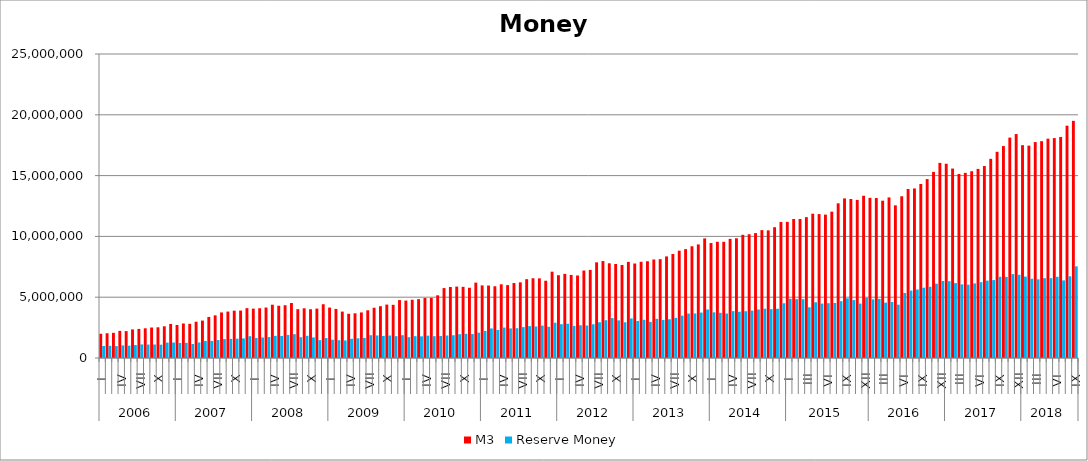
| Category | M3 | Reserve Money |
|---|---|---|
| 0 | 1993635.252 | 985529.837 |
| 1 | 2034234.826 | 1006861.291 |
| 2 | 2068041.342 | 981188.537 |
| 3 | 2231719.944 | 1037670.32 |
| 4 | 2211726.006 | 1017229.525 |
| 5 | 2350643.488 | 1063055.584 |
| 6 | 2391487.856 | 1117976.357 |
| 7 | 2443084.258 | 1106750.341 |
| 8 | 2508732.57 | 1112012.223 |
| 9 | 2525728.196 | 1095465.011 |
| 10 | 2606222.861 | 1267573.815 |
| 11 | 2799779.664 | 1272098.537 |
| 12 | 2712080.574 | 1232053.134 |
| 13 | 2839247.957 | 1248398.16 |
| 14 | 2809129.727 | 1153980.424 |
| 15 | 2983302.624 | 1277207.234 |
| 16 | 3078896.375 | 1403307.841 |
| 17 | 3374827.695 | 1404077.538 |
| 18 | 3507235.628 | 1479672.329 |
| 19 | 3747060.191 | 1555771.96 |
| 20 | 3818751.76 | 1574900.45 |
| 21 | 3892352.971 | 1588923.076 |
| 22 | 3901496.079 | 1610500.365 |
| 23 | 4098857.212 | 1793802.01 |
| 24 | 4058253.618 | 1652937.267 |
| 25 | 4091244.212 | 1686843.876 |
| 26 | 4150553.585 | 1722001.473 |
| 27 | 4381379.554 | 1820171.278 |
| 28 | 4298190.088 | 1815126.575 |
| 29 | 4341414.027 | 1897531.247 |
| 30 | 4525406.244 | 1960868.235 |
| 31 | 4014687.917 | 1706188.166 |
| 32 | 4089682.299 | 1828526.98 |
| 33 | 4009512.363 | 1691326.122 |
| 34 | 4062943.074 | 1470551.675 |
| 35 | 4421698.466 | 1642080.787 |
| 36 | 4146756.21 | 1505078.055 |
| 37 | 4035788.433 | 1464069.396 |
| 38 | 3815625.073 | 1441942.103 |
| 39 | 3637932.132 | 1578292.367 |
| 40 | 3676519.248 | 1622579.421 |
| 41 | 3746883.705 | 1654014.811 |
| 42 | 3922696.007 | 1872828.703 |
| 43 | 4133600.643 | 1856192.394 |
| 44 | 4258468.82 | 1815233.312 |
| 45 | 4392845.734 | 1850711.225 |
| 46 | 4374192.684 | 1794464.923 |
| 47 | 4763606.912 | 1874961.354 |
| 48 | 4721982.505 | 1713536.285 |
| 49 | 4792163.56 | 1796688.9 |
| 50 | 4837431.557 | 1779992.609 |
| 51 | 4938622.79 | 1840471.316 |
| 52 | 4945487.009 | 1794174.909 |
| 53 | 5154387.443 | 1814725.803 |
| 54 | 5750227.904 | 1850494.326 |
| 55 | 5840047.26 | 1871816.662 |
| 56 | 5874149.127 | 1954729.072 |
| 57 | 5852007.985 | 1997836.737 |
| 58 | 5775636.555 | 1975036.135 |
| 59 | 6199008.806 | 2081128.752 |
| 60 | 5970729.983 | 2226103.832 |
| 61 | 5959087.97 | 2430168.133 |
| 62 | 5899005.704 | 2311380.782 |
| 63 | 6062639.273 | 2505955.775 |
| 64 | 5995136.02 | 2432249.082 |
| 65 | 6164201.229 | 2448706.203 |
| 66 | 6221284.913 | 2542648.036 |
| 67 | 6481689.318 | 2621687.544 |
| 68 | 6558253.631 | 2595533.261 |
| 69 | 6550014.362 | 2664580.778 |
| 70 | 6352920.652 | 2566552.114 |
| 71 | 7097777.273 | 2901038.828 |
| 72 | 6808396.175 | 2780440.849 |
| 73 | 6918705.592 | 2819931.093 |
| 74 | 6831744.234 | 2642386.812 |
| 75 | 6785908.965 | 2691389.762 |
| 76 | 7194518.793 | 2671575.273 |
| 77 | 7242926.553 | 2775361.632 |
| 78 | 7867540.374 | 2937987.976 |
| 79 | 7971705.487 | 3107541.586 |
| 80 | 7789118.852 | 3285540.123 |
| 81 | 7732668.513 | 3094823.14 |
| 82 | 7648449.547 | 2937213.459 |
| 83 | 7903738.971 | 3255313.659 |
| 84 | 7771222.7 | 3047796.187 |
| 85 | 7912345.956 | 3146225.813 |
| 86 | 7959105.687 | 2972028.987 |
| 87 | 8103469.276 | 3220089.371 |
| 88 | 8130730.824 | 3129434.801 |
| 89 | 8354699.149 | 3184262.276 |
| 90 | 8553410.296 | 3302037.366 |
| 91 | 8826582.176 | 3487678.696 |
| 92 | 8953801.477 | 3655478.769 |
| 93 | 9188613.332 | 3663277.537 |
| 94 | 9339568.079 | 3737236.26 |
| 95 | 9836618.601 | 3989083.317 |
| 96 | 9453972.937 | 3756141.816 |
| 97 | 9556546.423 | 3717320.784 |
| 98 | 9555304.952 | 3659706.219 |
| 99 | 9799048.091 | 3855909.639 |
| 100 | 9846212.502 | 3804159.071 |
| 101 | 10130909.316 | 3846993.656 |
| 102 | 10178205.898 | 3901000.343 |
| 103 | 10273632.539 | 3988861.155 |
| 104 | 10516743.129 | 4056513.111 |
| 105 | 10497444.423 | 4020878.96 |
| 106 | 10754604.791 | 4050811.645 |
| 107 | 11189835.906 | 4501009.92 |
| 108 | 11197675.774 | 4875122.328 |
| 109 | 11430746.277 | 4837812.334 |
| 110 | 11430746.277 | 4837812.334 |
| 111 | 11581239.857 | 4169036.036 |
| 112 | 11865515.017 | 4580597.986 |
| 113 | 11835307.744 | 4478239.223 |
| 114 | 11792213.073 | 4505863.791 |
| 115 | 12034462.526 | 4525163.426 |
| 116 | 12720190.151 | 4674624.879 |
| 117 | 13124203.995 | 4907397.413 |
| 118 | 13073662.228 | 4763122.409 |
| 119 | 12998223.563 | 4474717.337 |
| 120 | 13343921.268 | 4948158.146 |
| 121 | 13172033.37 | 4823667.329 |
| 122 | 13155832.444 | 4858795.624 |
| 123 | 12936581.332 | 4553776.684 |
| 124 | 13206213.457 | 4606530.89 |
| 125 | 12555625.602 | 4388431.419 |
| 126 | 13300944.539 | 5343112.251 |
| 127 | 13897993.631 | 5546009.052 |
| 128 | 13943466.797 | 5631585.796 |
| 129 | 14309304.721 | 5782125.992 |
| 130 | 14713510.721 | 5860814.898 |
| 131 | 15304596.052 | 6108426.466 |
| 132 | 16045200.01 | 6332535.477 |
| 133 | 15976224.093 | 6317838.859 |
| 134 | 15580104.218 | 6159989.306 |
| 135 | 15132806.692 | 6056015.159 |
| 136 | 15226347.996 | 6034338.878 |
| 137 | 15360147.87 | 6133256.108 |
| 138 | 15550758.151 | 6238062.995 |
| 139 | 15785246.683 | 6363688.254 |
| 140 | 16378805.759 | 6408158.005 |
| 141 | 16957721.336 | 6683210.873 |
| 142 | 17429301.938 | 6668622.166 |
| 143 | 18125077.324 | 6898984.047 |
| 144 | 18416278.044 | 6842923.373 |
| 145 | 17501935.182 | 6693637.928 |
| 146 | 17463278.92 | 6517959.429 |
| 147 | 17756925.753 | 6474034.831 |
| 148 | 17830710.048 | 6565140.29 |
| 149 | 18037847.494 | 6564370.705 |
| 150 | 18084477.007 | 6679239.605 |
| 151 | 18177750.876 | 6382996.535 |
| 152 | 19106163.443 | 6719330.301 |
| 153 | 19504220.662 | 7540075.346 |